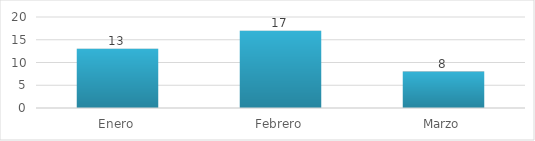
| Category | Series 0 |
|---|---|
| Enero | 13 |
| Febrero | 17 |
| Marzo | 8 |